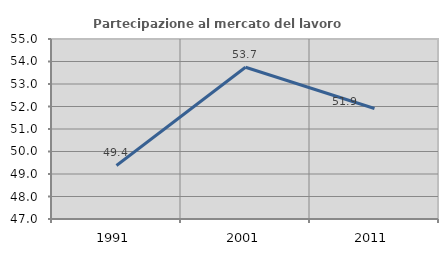
| Category | Partecipazione al mercato del lavoro  femminile |
|---|---|
| 1991.0 | 49.38 |
| 2001.0 | 53.743 |
| 2011.0 | 51.912 |